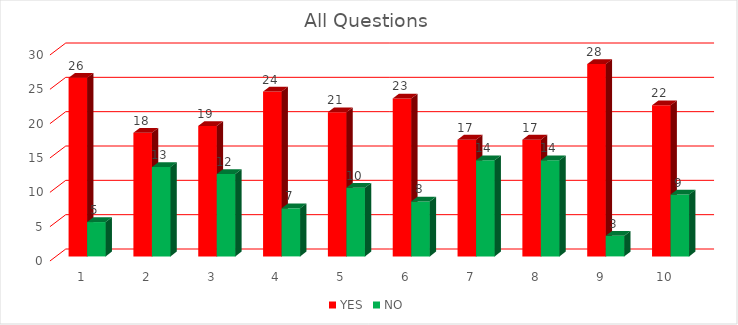
| Category | YES | NO |
|---|---|---|
| 0 | 26 | 5 |
| 1 | 18 | 13 |
| 2 | 19 | 12 |
| 3 | 24 | 7 |
| 4 | 21 | 10 |
| 5 | 23 | 8 |
| 6 | 17 | 14 |
| 7 | 17 | 14 |
| 8 | 28 | 3 |
| 9 | 22 | 9 |